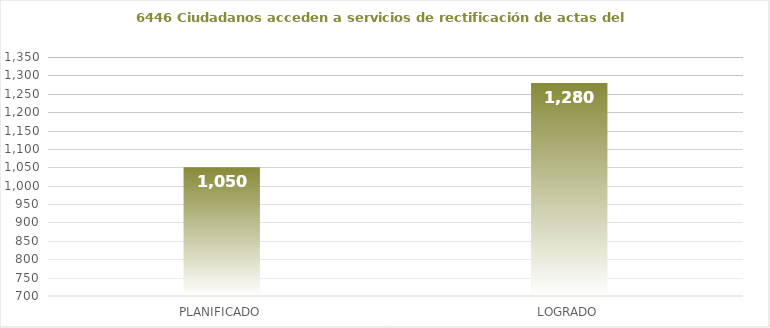
| Category | 6446 |
|---|---|
| PLANIFICADO | 1050 |
| LOGRADO | 1280 |